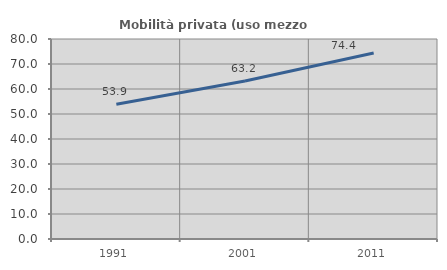
| Category | Mobilità privata (uso mezzo privato) |
|---|---|
| 1991.0 | 53.907 |
| 2001.0 | 63.189 |
| 2011.0 | 74.414 |